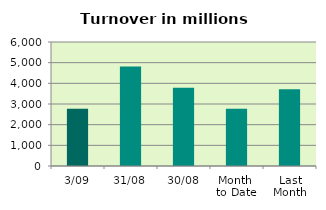
| Category | Series 0 |
|---|---|
| 3/09 | 2774.351 |
| 31/08 | 4809.329 |
| 30/08 | 3786.14 |
| Month 
to Date | 2774.351 |
| Last
Month | 3714.081 |